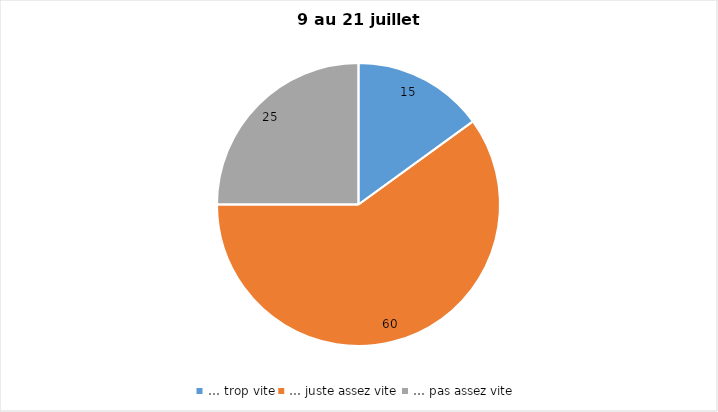
| Category | Series 0 |
|---|---|
| … trop vite | 15 |
| … juste assez vite | 60 |
| … pas assez vite | 25 |